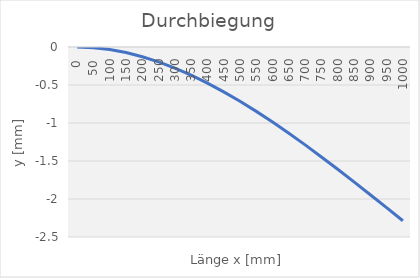
| Category | Series 0 |
|---|---|
| 0.0 | 0 |
| 50.0 | -0.008 |
| 100.0 | -0.033 |
| 150.0 | -0.073 |
| 200.0 | -0.128 |
| 250.0 | -0.196 |
| 300.0 | -0.278 |
| 350.0 | -0.371 |
| 400.0 | -0.475 |
| 450.0 | -0.59 |
| 500.0 | -0.714 |
| 550.0 | -0.847 |
| 600.0 | -0.987 |
| 650.0 | -1.135 |
| 700.0 | -1.288 |
| 750.0 | -1.446 |
| 800.0 | -1.609 |
| 850.0 | -1.775 |
| 900.0 | -1.944 |
| 950.0 | -2.114 |
| 1000.0 | -2.286 |